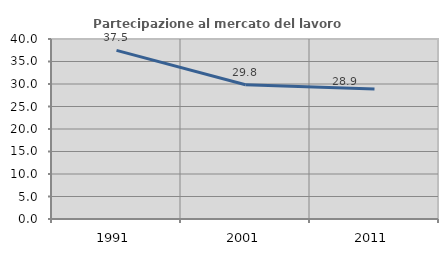
| Category | Partecipazione al mercato del lavoro  femminile |
|---|---|
| 1991.0 | 37.469 |
| 2001.0 | 29.831 |
| 2011.0 | 28.912 |